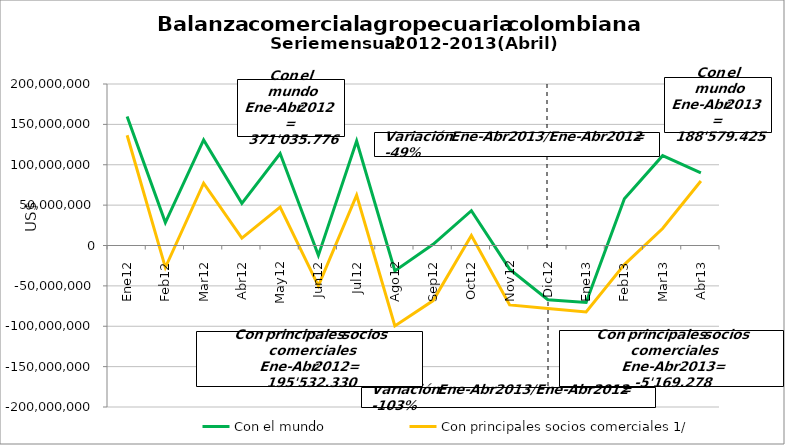
| Category | Con el mundo | Con principales socios comerciales 1/ |
|---|---|---|
| 0 | 159718841.64 | 136512559.15 |
| 1 | 28365041.12 | -27310538.96 |
| 2 | 130703974.8 | 77162793.95 |
| 3 | 52247918.23 | 9167516.04 |
| 4 | 113869717.7 | 47484687.99 |
| 5 | -12237480.38 | -49905103.17 |
| 6 | 129307528.98 | 62289588.94 |
| 7 | -31469442.96 | -99655288.8 |
| 8 | 1432914.69 | -68233798.35 |
| 9 | 43090007.69 | 12349362.4 |
| 10 | -29233824.97 | -73616420.86 |
| 11 | -67196777.37 | -78049009.56 |
| 12 | -70591672.64 | -82319988.74 |
| 13 | 57888002.76 | -23688311.13 |
| 14 | 111239208.87 | 21002192.72 |
| 15 | 90043885.64 | 79836829.52 |